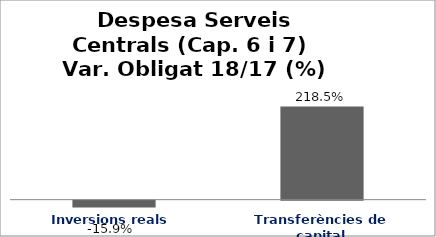
| Category | Series 0 |
|---|---|
| Inversions reals | -0.159 |
| Transferències de capital | 2.185 |